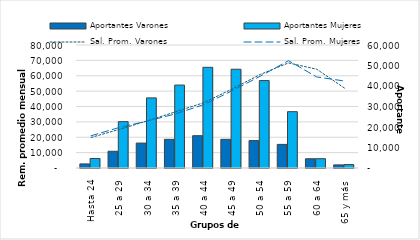
| Category | Aportantes Varones | Aportantes Mujeres |
|---|---|---|
| Hasta 24 | 1992 | 4641 |
| 25 a 29 | 8163 | 22610 |
| 30 a 34 | 12156 | 34197 |
| 35 a 39 | 13980 | 40450 |
| 40 a 44 | 15760 | 49115 |
| 45 a 49 | 13990 | 48183 |
| 50 a 54 | 13376 | 42648 |
| 55 a 59 | 11510 | 27481 |
| 60 a 64 | 4509 | 4542 |
| 65 y más | 1510 | 1684 |